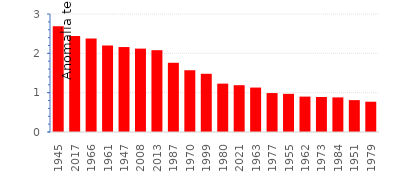
| Category | ABR |
|---|---|
| 1945.0 | 2.69 |
| 2017.0 | 2.44 |
| 1966.0 | 2.38 |
| 1961.0 | 2.2 |
| 1947.0 | 2.16 |
| 2008.0 | 2.12 |
| 2013.0 | 2.08 |
| 1987.0 | 1.76 |
| 1970.0 | 1.57 |
| 1999.0 | 1.48 |
| 1980.0 | 1.23 |
| 2021.0 | 1.19 |
| 1963.0 | 1.13 |
| 1977.0 | 0.99 |
| 1955.0 | 0.97 |
| 1962.0 | 0.9 |
| 1973.0 | 0.89 |
| 1984.0 | 0.88 |
| 1951.0 | 0.81 |
| 1979.0 | 0.77 |